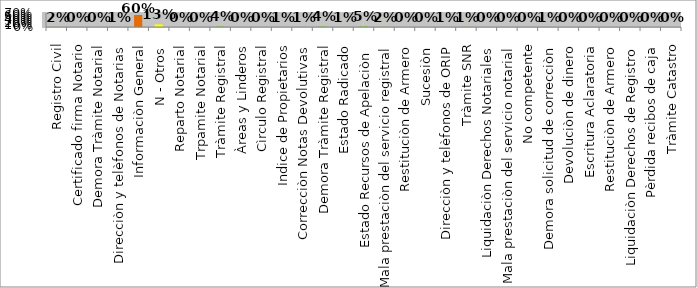
| Category | Series 0 |
|---|---|
| Registro Civil | 0.015 |
| Certificado firma Notario | 0.003 |
| Demora Tràmite Notarial | 0.002 |
| Direcciòn y telèfonos de Notarias | 0.007 |
| Informaciòn General | 0.603 |
| N - Otros  | 0.13 |
| Reparto Notarial | 0.003 |
| Trpamite Notarial | 0.002 |
| Tràmite Registral | 0.043 |
| Àreas y Linderos | 0 |
| Cìrculo Registral | 0.001 |
| Indice de Propietarios | 0.006 |
| Correcciòn Notas Devolutivas | 0.008 |
| Demora Tràmite Registral | 0.042 |
| Estado Radicado | 0.014 |
| Estado Recursos de Apelaciòn  | 0.053 |
| Mala prestaciòn del servicio registral | 0.023 |
| Restituciòn de Armero | 0.001 |
| Sucesiòn  | 0 |
| Direcciòn y telèfonos de ORIP | 0.006 |
| Tràmite SNR | 0.015 |
| Liquidaciòn Derechos Notariales | 0.001 |
| Mala prestaciòn del servicio notarial | 0.001 |
| No competente | 0.005 |
| Demora solicitud de correcciòn | 0.008 |
| Devoluciòn de dinero | 0.001 |
| Escritura Aclaratoria | 0 |
| Restituciòn de Armero | 0.001 |
| Liquidaciòn Derechos de Registro | 0.004 |
| Pèrdida recibos de caja | 0 |
| Tràmite Catastro | 0.001 |